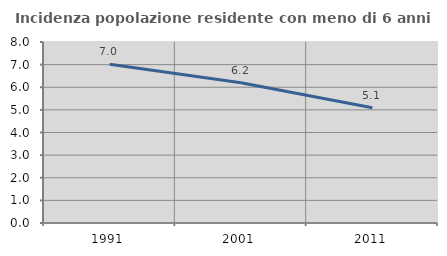
| Category | Incidenza popolazione residente con meno di 6 anni |
|---|---|
| 1991.0 | 7.019 |
| 2001.0 | 6.203 |
| 2011.0 | 5.091 |